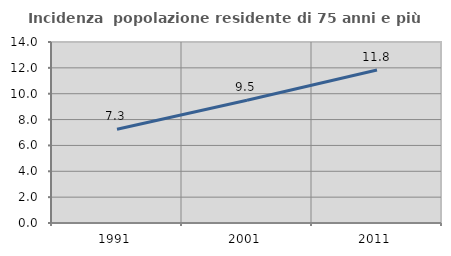
| Category | Incidenza  popolazione residente di 75 anni e più |
|---|---|
| 1991.0 | 7.251 |
| 2001.0 | 9.491 |
| 2011.0 | 11.831 |